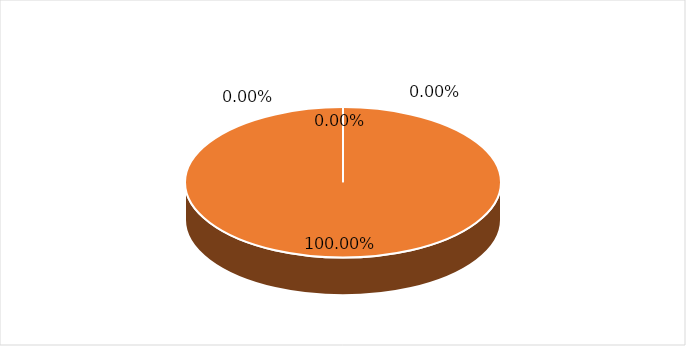
| Category | Series 0 | Series 1 |
|---|---|---|
| Estudiantes | 0 | 0 |
| Profesionales | 1 | 1 |
| ADESCOS | 0 | 0 |
| Otro | 0 | 0 |